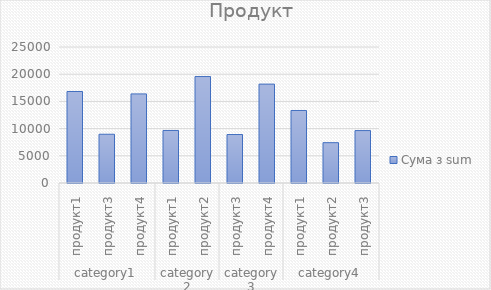
| Category | Підсумок |
|---|---|
| 0 | 16820 |
| 1 | 8963 |
| 2 | 16377 |
| 3 | 9658 |
| 4 | 19567 |
| 5 | 8910 |
| 6 | 18178 |
| 7 | 13332 |
| 8 | 7412 |
| 9 | 9635 |